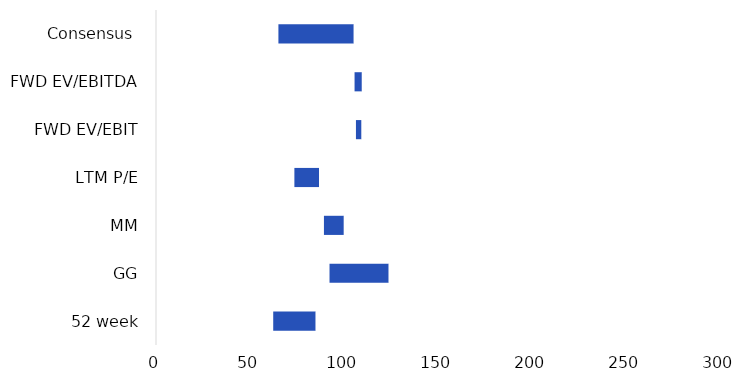
| Category | Series 0 | Series 1 | Series 2 |
|---|---|---|---|
| 52 week | 62.24 | 22.55 | 84.79 |
| GG | 92.136 | 31.419 | 123.555 |
| MM | 89.169 | 10.561 | 99.73 |
| LTM P/E | 73.479 | 13.103 | 86.582 |
| FWD EV/EBIT | 106.164 | 2.976 | 109.14 |
| FWD EV/EBITDA | 105.429 | 3.876 | 109.305 |
| Consensus  | 65 | 40 | 105 |